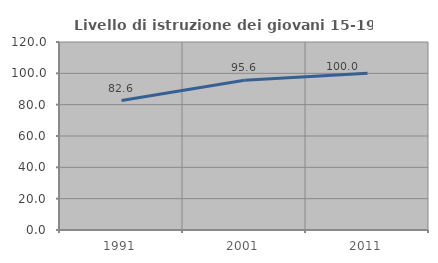
| Category | Livello di istruzione dei giovani 15-19 anni |
|---|---|
| 1991.0 | 82.609 |
| 2001.0 | 95.556 |
| 2011.0 | 100 |